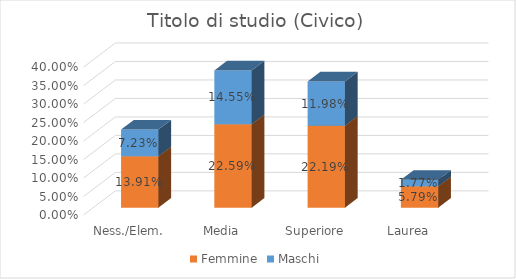
| Category | Femmine | Maschi |
|---|---|---|
| Ness./Elem. | 0.139 | 0.072 |
| Media | 0.226 | 0.145 |
| Superiore | 0.222 | 0.12 |
| Laurea | 0.058 | 0.018 |